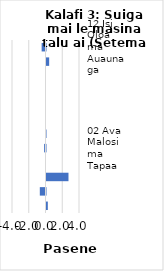
| Category | All items - m-m changes |
|---|---|
| 12 Isi Oloa ma Auaunaga | -0.461 |
| 05 Meafale, Mea Faigaleuga mo Faaleleia o Aiga | 0.319 |
| 11 Faleaiga | 0 |
| 10 Aoaoga | 0 |
| 06 Soifua Maloloina | 0 |
| 08 Fesootaiga | 0 |
| 03 Lavalava ma Seevae | -0.052 |
| 02 Ava Malosi ma Tapaa | -0.165 |
| 09 Faafiafiaga ma Aganuu | 0 |
| 07 Femalagaiga | 2.625 |
| 01 Meaai ma Vaiinu | -0.679 |
| 04 Fale, Suavai, Eletise, Kesi ma isi | 0.159 |